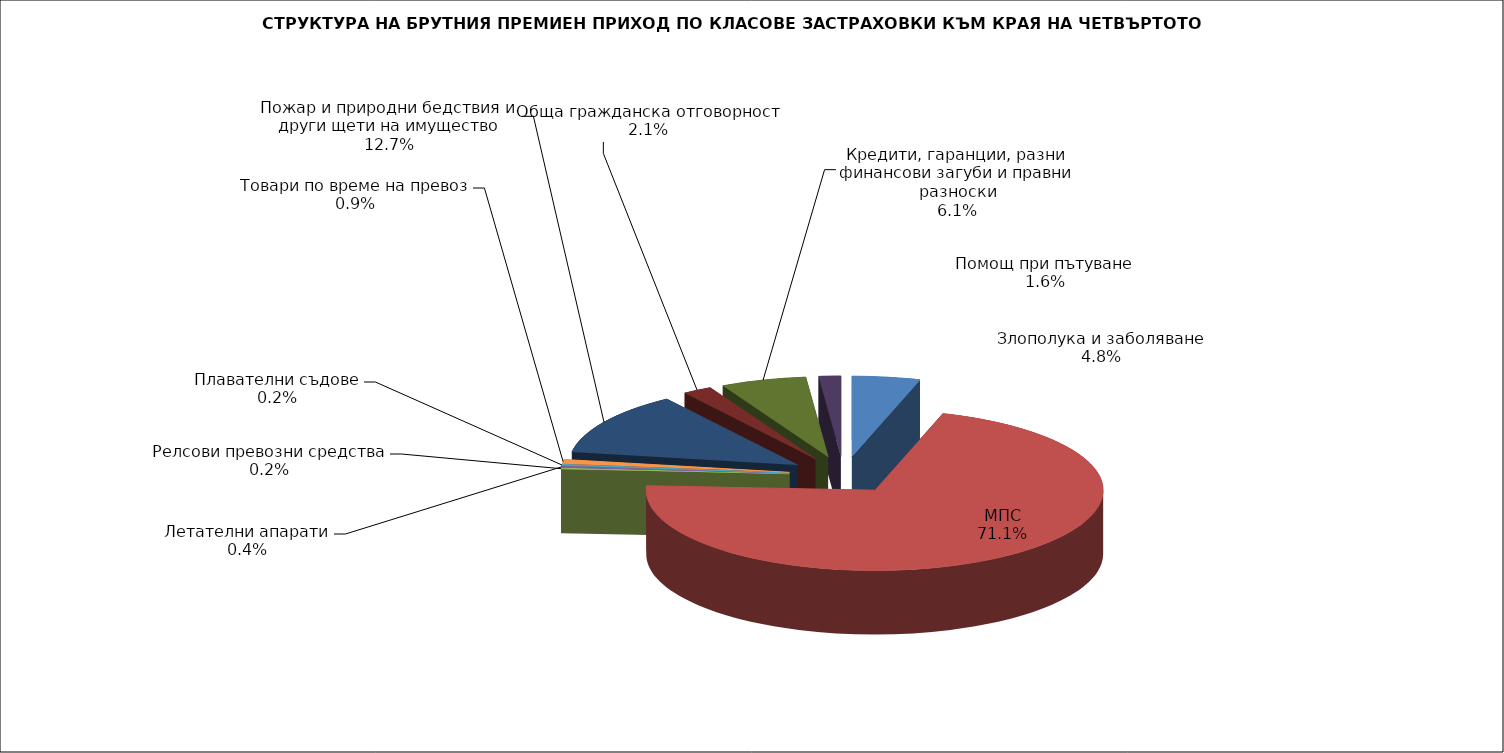
| Category | Злополука и заболяване |
|---|---|
| Злополука и заболяване | 0.048 |
| МПС | 0.711 |
| Релсови превозни средства | 0.002 |
| Летателни апарати | 0.004 |
| Плавателни съдове | 0.002 |
| Товари по време на превоз | 0.009 |
| Пожар и природни бедствия и други щети на имущество | 0.127 |
| Обща гражданска отговорност | 0.021 |
| Кредити, гаранции, разни финансови загуби и правни разноски | 0.061 |
| Помощ при пътуване | 0.016 |